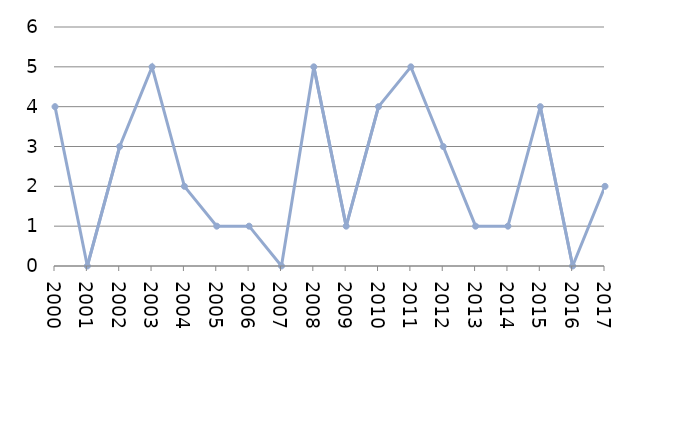
| Category | Avlidna |
|---|---|
| 2000 | 4 |
| 2001 | 0 |
| 2002 | 3 |
| 2003 | 5 |
| 2004 | 2 |
| 2005 | 1 |
| 2006 | 1 |
| 2007 | 0 |
| 2008 | 5 |
| 2009 | 1 |
| 2010 | 4 |
| 2011 | 5 |
| 2012 | 3 |
| 2013 | 1 |
| 2014 | 1 |
| 2015 | 4 |
| 2016 | 0 |
| 2017 | 2 |